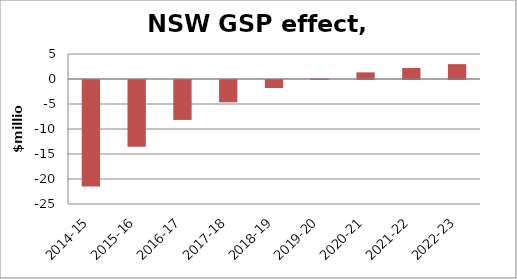
| Category | Series 0 |
|---|---|
| 2014-15 | -21.306 |
| 2015-16 | -13.342 |
| 2016-17 | -7.989 |
| 2017-18 | -4.459 |
| 2018-19 | -1.598 |
| 2019-20 | 0.101 |
| 2020-21 | 1.327 |
| 2021-22 | 2.215 |
| 2022-23 | 2.971 |